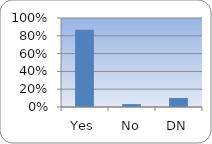
| Category | Series 0 |
|---|---|
| Yes | 0.867 |
| No | 0.032 |
| DN | 0.101 |